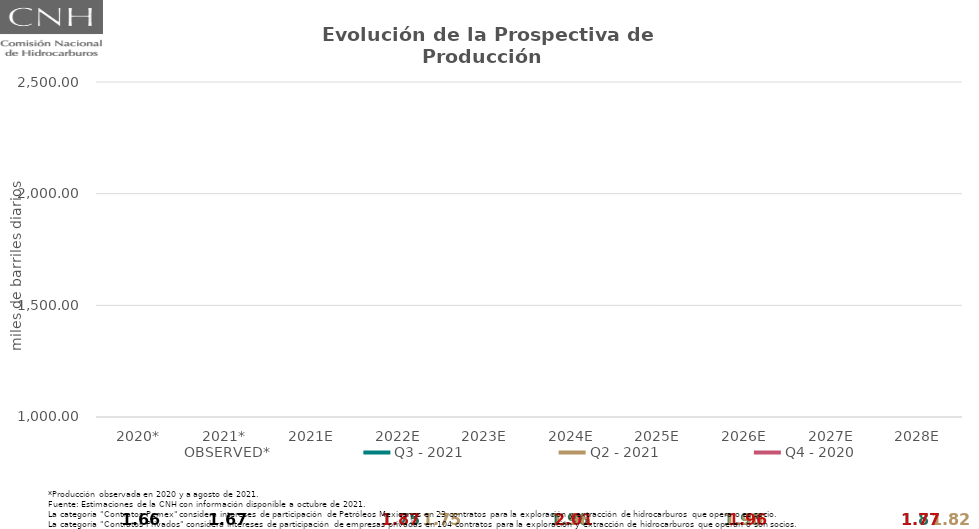
| Category | OBSERVED* | Q3 - 2021 | Q2 - 2021 | Q4 - 2020 |
|---|---|---|---|---|
| 2020* | 1.663 | 1.663 | 1.663 | 1.663 |
| 2021* | 1.67 | 1.67 | 1.67 | 1.67 |
| 2021E | 1.659 | 1.659 | 1.683 | 1.78 |
| 2022E | 1.746 | 1.746 | 1.749 | 1.868 |
| 2023E | 1.925 | 1.925 | 1.968 | 1.985 |
| 2024E | 1.956 | 1.956 | 1.985 | 2.014 |
| 2025E | 1.973 | 1.973 | 1.949 | 1.986 |
| 2026E | 1.932 | 1.932 | 1.896 | 1.964 |
| 2027E | 1.95 | 1.95 | 1.922 | 1.908 |
| 2028E | 1.866 | 1.866 | 1.818 | 1.768 |